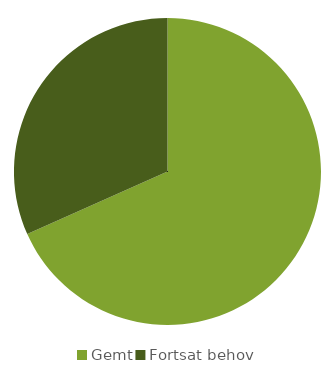
| Category | Series 0 | Series 1 |
|---|---|---|
| 0 | 4100 |  |
| 1 | 1900 |  |